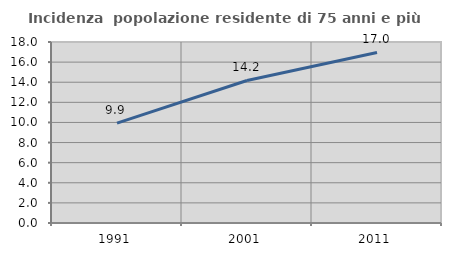
| Category | Incidenza  popolazione residente di 75 anni e più |
|---|---|
| 1991.0 | 9.931 |
| 2001.0 | 14.176 |
| 2011.0 | 16.959 |